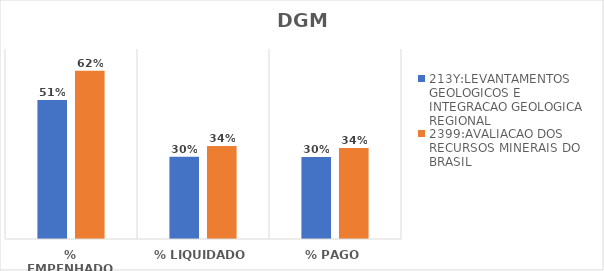
| Category | 213Y:LEVANTAMENTOS GEOLOGICOS E INTEGRACAO GEOLOGICA REGIONAL | 2399:AVALIACAO DOS RECURSOS MINERAIS DO BRASIL |
|---|---|---|
| % EMPENHADO | 0.512 | 0.62 |
| % LIQUIDADO | 0.303 | 0.342 |
| % PAGO | 0.302 | 0.335 |